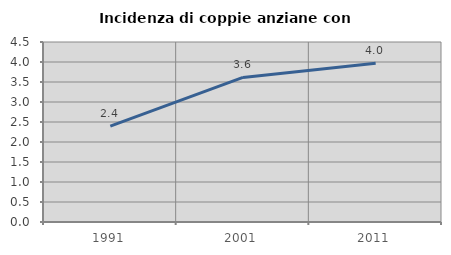
| Category | Incidenza di coppie anziane con figli |
|---|---|
| 1991.0 | 2.397 |
| 2001.0 | 3.615 |
| 2011.0 | 3.97 |